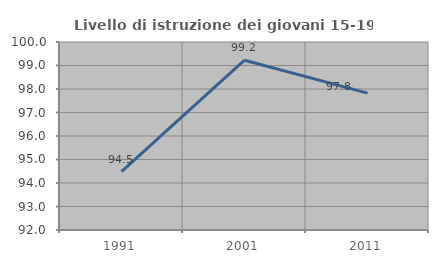
| Category | Livello di istruzione dei giovani 15-19 anni |
|---|---|
| 1991.0 | 94.488 |
| 2001.0 | 99.225 |
| 2011.0 | 97.826 |